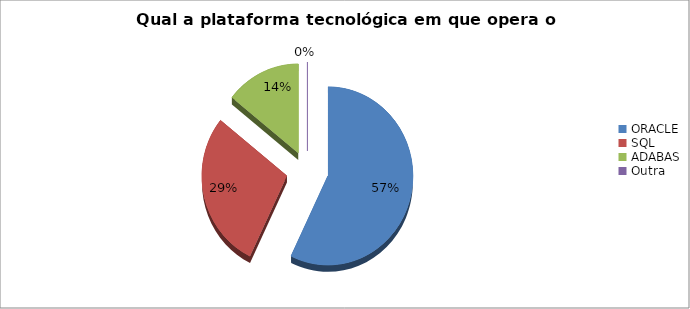
| Category | Series 0 |
|---|---|
| ORACLE | 0.571 |
| SQL | 0.286 |
| ADABAS | 0.143 |
| Outra | 0 |